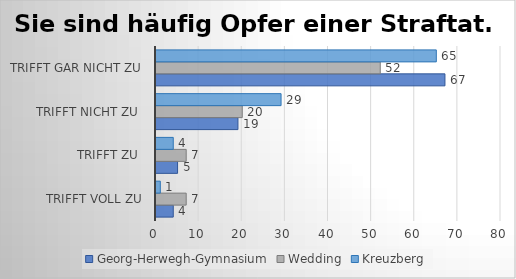
| Category | Georg-Herwegh-Gymnasium | Wedding | Kreuzberg |
|---|---|---|---|
| trifft voll zu | 4 | 7 | 1 |
| trifft zu  | 5 | 7 | 4 |
| trifft nicht zu  | 19 | 20 | 29 |
| trifft gar nicht zu | 67 | 52 | 65 |